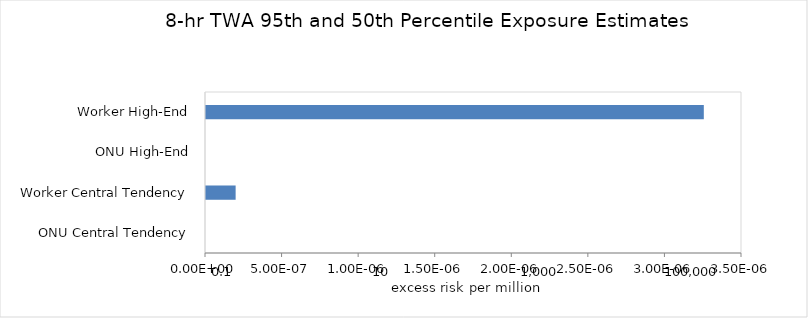
| Category | Series 0 |
|---|---|
| ONU Central Tendency | 0 |
| Worker Central Tendency | 0 |
| ONU High-End | 0 |
| Worker High-End | 0 |